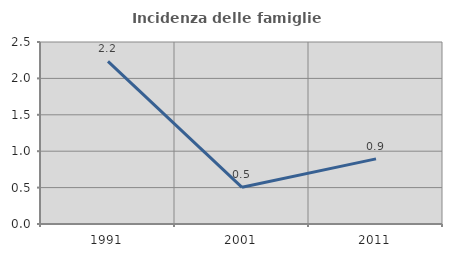
| Category | Incidenza delle famiglie numerose |
|---|---|
| 1991.0 | 2.233 |
| 2001.0 | 0.504 |
| 2011.0 | 0.894 |